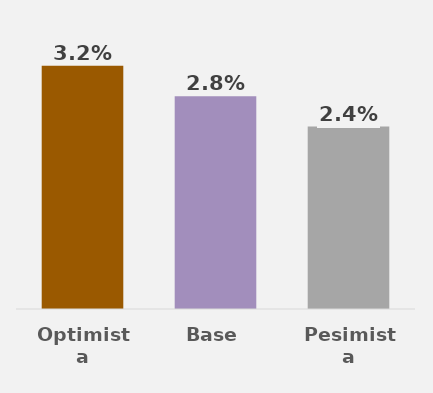
| Category | Series 0 |
|---|---|
| Optimista | 0.032 |
| Base | 0.028 |
| Pesimista | 0.024 |